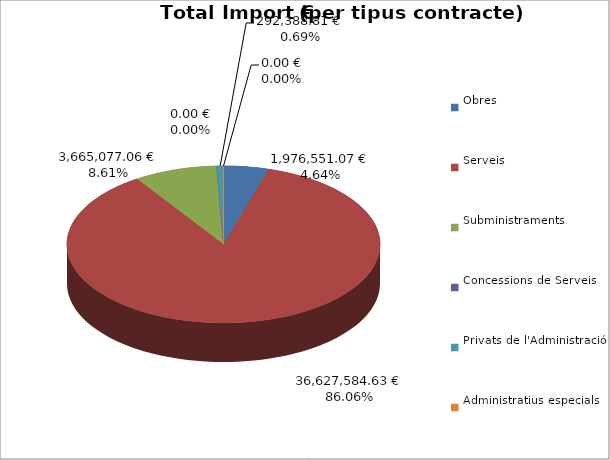
| Category | Total preu
(amb IVA) |
|---|---|
| Obres | 1976551.07 |
| Serveis | 36627584.63 |
| Subministraments | 3665077.06 |
| Concessions de Serveis | 0 |
| Privats de l'Administració | 292388.81 |
| Administratius especials | 0 |